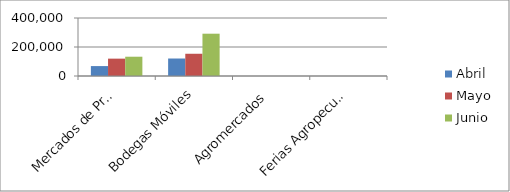
| Category | Abril | Mayo | Junio |
|---|---|---|---|
| Mercados de Productores | 68400 | 119700 | 133000 |
| Bodegas Móviles | 120640 | 153400 | 291720 |
| Agromercados | 0 | 0 | 0 |
| Ferias Agropecuarias | 0 | 0 | 0 |